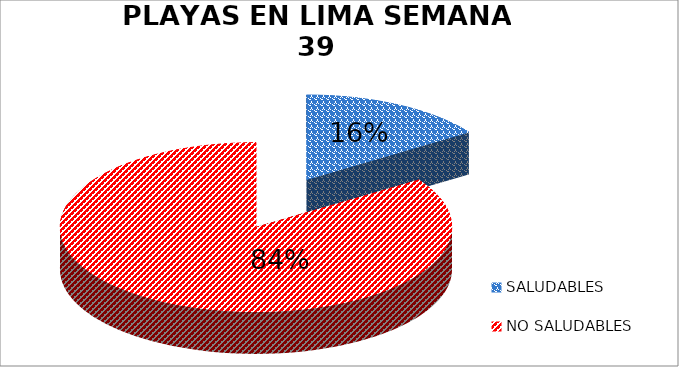
| Category | N.° |
|---|---|
| SALUDABLES | 9 |
| NO SALUDABLES | 49 |